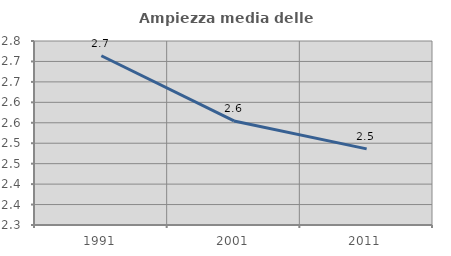
| Category | Ampiezza media delle famiglie |
|---|---|
| 1991.0 | 2.714 |
| 2001.0 | 2.555 |
| 2011.0 | 2.486 |